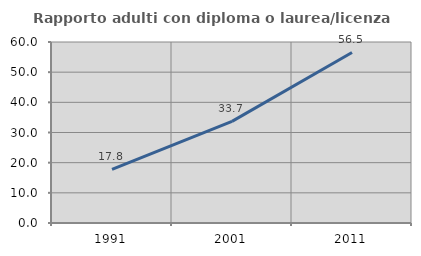
| Category | Rapporto adulti con diploma o laurea/licenza media  |
|---|---|
| 1991.0 | 17.808 |
| 2001.0 | 33.696 |
| 2011.0 | 56.522 |